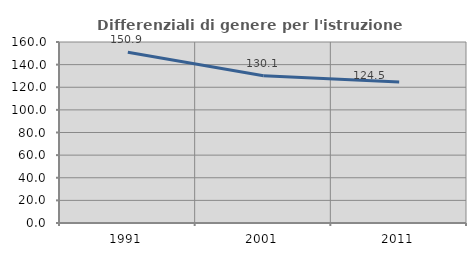
| Category | Differenziali di genere per l'istruzione superiore |
|---|---|
| 1991.0 | 150.889 |
| 2001.0 | 130.122 |
| 2011.0 | 124.533 |